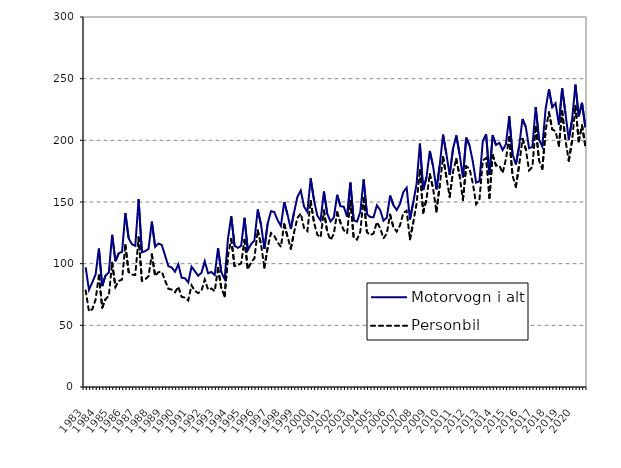
| Category | Motorvogn i alt | Personbil |
|---|---|---|
| 1983.0 | 97 | 78.3 |
| nan | 78.8 | 61.3 |
| nan | 84.8 | 63 |
| nan | 91.2 | 70.8 |
| 1984.0 | 112.2 | 90.4 |
| nan | 81.8 | 64.4 |
| nan | 90.4 | 71.1 |
| nan | 92.9 | 73.9 |
| 1985.0 | 123.4 | 100.8 |
| nan | 102 | 81.1 |
| nan | 108.4 | 86 |
| nan | 109.6 | 87.1 |
| 1986.0 | 141 | 115.2 |
| nan | 120.5 | 93.2 |
| nan | 115.7 | 91.1 |
| nan | 114.4 | 90.8 |
| 1987.0 | 152.2 | 121.3 |
| nan | 109.2 | 86.1 |
| nan | 110.1 | 87.3 |
| nan | 112 | 89.8 |
| 1988.0 | 134.1 | 107.5 |
| nan | 113.7 | 90 |
| nan | 116.3 | 93.1 |
| nan | 115.2 | 93.4 |
| 1989.0 | 106.6 | 86.4 |
| nan | 98 | 79.6 |
| nan | 96.9 | 79 |
| nan | 93.4 | 76.8 |
| 1990.0 | 99.4 | 81.3 |
| nan | 88.6 | 73.1 |
| nan | 88.2 | 72.5 |
| nan | 84.8 | 70.2 |
| 1991.0 | 97.5 | 82.4 |
| nan | 93.9 | 78 |
| nan | 90.2 | 76.1 |
| nan | 92.6 | 78.1 |
| 1992.0 | 102 | 87.1 |
| nan | 92.2 | 78.9 |
| nan | 93.3 | 79.9 |
| nan | 90.8 | 77.6 |
| 1993.0 | 112.6 | 96.5 |
| nan | 93 | 80.1 |
| nan | 87.5 | 73.6 |
| nan | 120.1 | 106.6 |
| 1994.0 | 138.4 | 120 |
| nan | 114.5 | 98.1 |
| nan | 112.8 | 98.8 |
| nan | 114.5 | 100.2 |
| 1995.0 | 137.2 | 119.3 |
| nan | 111 | 95.4 |
| nan | 115.9 | 101 |
| nan | 118.8 | 104.4 |
| 1996.0 | 143.9 | 126.9 |
| nan | 131.6 | 115.7 |
| nan | 112 | 96.7 |
| nan | 132.5 | 113.1 |
| 1997.0 | 142.6 | 124.8 |
| nan | 141.8 | 122.5 |
| nan | 135.4 | 117.3 |
| nan | 130.6 | 113.7 |
| 1998.0 | 150 | 131.9 |
| nan | 139.8 | 122 |
| nan | 128.1 | 112.1 |
| nan | 141.8 | 125.6 |
| 1999.0 | 154.2 | 137.1 |
| nan | 159.3 | 140.7 |
| nan | 146.3 | 128.7 |
| nan | 141.9 | 126.4 |
| 2000.0 | 169.1 | 150.9 |
| nan | 151.5 | 133.4 |
| nan | 139 | 123.5 |
| nan | 135.1 | 121.4 |
| 2001.0 | 158.5 | 143.1 |
| nan | 140.46 | 125.7 |
| nan | 134.24 | 119.2 |
| nan | 137.495 | 124.072 |
| 2002.0 | 155.814 | 141.724 |
| nan | 146.543 | 133.19 |
| nan | 146.231 | 127.141 |
| nan | 137.967 | 124.641 |
| 2003.0 | 165.679 | 150.811 |
| nan | 135.021 | 121.101 |
| nan | 134.111 | 119.491 |
| nan | 142.013 | 125.959 |
| 2004.0 | 168.309 | 153.043 |
| nan | 140.267 | 125.568 |
| nan | 137.77 | 123.121 |
| nan | 137.685 | 124.506 |
| 2005.0 | 147.311 | 133.756 |
| nan | 143.517 | 128.79 |
| nan | 134.783 | 120.571 |
| nan | 137.37 | 124.382 |
| 2006.0 | 155.213 | 139.728 |
| nan | 147.444 | 129.572 |
| nan | 143.451 | 126.006 |
| nan | 148.561 | 131.195 |
| 2007.0 | 158.1 | 141.084 |
| nan | 161.613 | 142.897 |
| nan | 135.821 | 119.753 |
| nan | 149.791 | 133.498 |
| 2008.0 | 164.642 | 148.614 |
| nan | 197.287 | 175.714 |
| nan | 159.718 | 141.407 |
| nan | 170.057 | 152.54 |
| 2009.0 | 191.38 | 172.559 |
| nan | 178.906 | 160.765 |
| nan | 160.234 | 142.312 |
| nan | 179.857 | 163.532 |
| 2010.0 | 204.636 | 186.507 |
| nan | 188.957 | 170.463 |
| nan | 172.077 | 154.156 |
| nan | 192.961 | 174.399 |
| 2011.0 | 204.005 | 184.86 |
| nan | 188.741 | 171.333 |
| nan | 169.934 | 151.694 |
| nan | 202.176 | 178.919 |
| 2012.0 | 195.829 | 177.072 |
| nan | 182.751 | 165.128 |
| nan | 165.73 | 148.242 |
| nan | 166.805 | 151.728 |
| 2013.0 | 199.181 | 183.653 |
| nan | 205.015 | 185.634 |
| nan | 172.044 | 153.21 |
| nan | 204.1 | 188.079 |
| 2014.0 | 196.177 | 179.552 |
| nan | 197.965 | 179.767 |
| nan | 192.105 | 173.474 |
| nan | 196.809 | 184.739 |
| 2015.0 | 219.419 | 202.592 |
| nan | 188.696 | 171.451 |
| nan | 180.388 | 162.297 |
| nan | 195.23 | 179.891 |
| 2016.0 | 217.298 | 201.197 |
| nan | 210.949 | 192.893 |
| nan | 193.648 | 175.642 |
| nan | 194.663 | 178.455 |
| 2017.0 | 227.029 | 210.738 |
| nan | 200.767 | 183.708 |
| nan | 195.059 | 176.766 |
| nan | 225.423 | 208.218 |
| 2018.0 | 241.528 | 222.678 |
| nan | 226.771 | 208.839 |
| nan | 230.044 | 207.395 |
| nan | 212.667 | 195.666 |
| 2019.0 | 242.056 | 223.584 |
| nan | 221.711 | 199.972 |
| nan | 200.668 | 183.518 |
| nan | 216.92 | 199.72 |
| 2020.0 | 245.163 | 227.947 |
| nan | 219.434 | 199.239 |
| nan | 230.409 | 212.039 |
| nan | 210.538 | 195.423 |